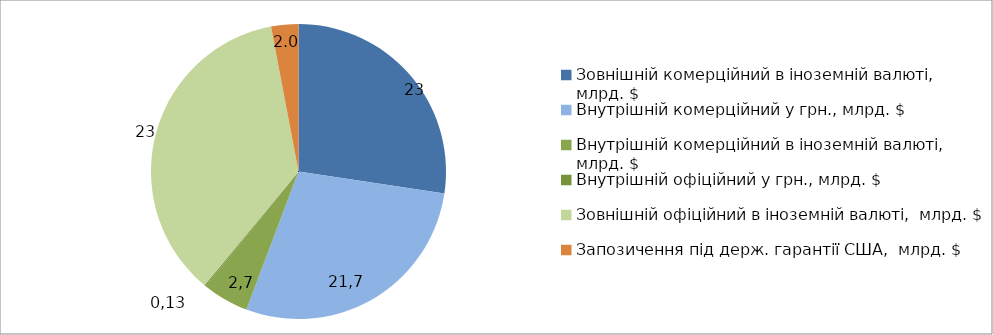
| Category | Series 0 |
|---|---|
| Зовнішній комерційний в іноземній валюті,  млрд. $ | 18.368 |
| Внутрішній комерційний у грн., млрд. $ | 19.036 |
| Внутрішній комерційний в іноземній валюті,  млрд. $ | 3.407 |
| Внутрішній офіційний у грн., млрд. $ | 0.104 |
| Зовнішній офіційний в іноземній валюті,  млрд. $ | 24.176 |
| Запозичення під держ. гарантії США,  млрд. $ | 2 |